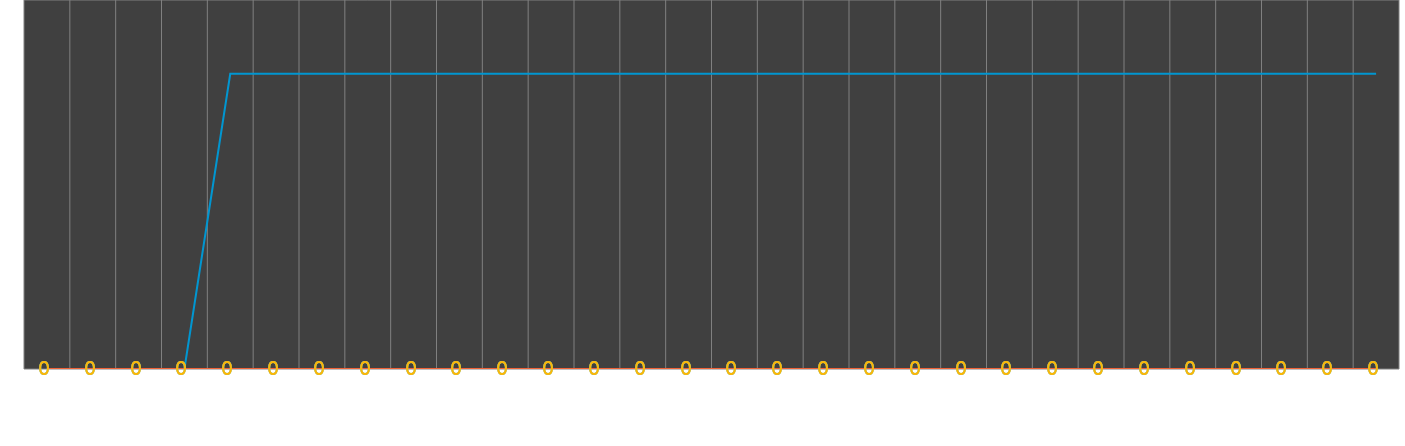
| Category | Opened | Closed | Opened Lables | Closed Labels |
|---|---|---|---|---|
| 5/1/18 | 0 | 0 | 0.08 | 0.08 |
| 5/2/18 | 0 | 0 | 0.08 | 0.08 |
| 5/3/18 | 0 | 0 | 0.08 | 0.08 |
| 5/4/18 | 0 | 0 | 0.08 | 0.08 |
| 5/5/18 | 2 | 0 | 2.08 | 0.08 |
| 5/6/18 | 2 | 0 | 2.08 | 0.08 |
| 5/7/18 | 2 | 0 | 2.08 | 0.08 |
| 5/8/18 | 2 | 0 | 2.08 | 0.08 |
| 5/9/18 | 2 | 0 | 2.08 | 0.08 |
| 5/10/18 | 2 | 0 | 2.08 | 0.08 |
| 5/11/18 | 2 | 0 | 2.08 | 0.08 |
| 5/12/18 | 2 | 0 | 2.08 | 0.08 |
| 5/13/18 | 2 | 0 | 2.08 | 0.08 |
| 5/14/18 | 2 | 0 | 2.08 | 0.08 |
| 5/15/18 | 2 | 0 | 2.08 | 0.08 |
| 5/16/18 | 2 | 0 | 2.08 | 0.08 |
| 5/17/18 | 2 | 0 | 2.08 | 0.08 |
| 5/18/18 | 2 | 0 | 2.08 | 0.08 |
| 5/19/18 | 2 | 0 | 2.08 | 0.08 |
| 5/20/18 | 2 | 0 | 2.08 | 0.08 |
| 5/21/18 | 2 | 0 | 2.08 | 0.08 |
| 5/22/18 | 2 | 0 | 2.08 | 0.08 |
| 5/23/18 | 2 | 0 | 2.08 | 0.08 |
| 5/24/18 | 2 | 0 | 2.08 | 0.08 |
| 5/25/18 | 2 | 0 | 2.08 | 0.08 |
| 5/26/18 | 2 | 0 | 2.08 | 0.08 |
| 5/27/18 | 2 | 0 | 2.08 | 0.08 |
| 5/28/18 | 2 | 0 | 2.08 | 0.08 |
| 5/29/18 | 2 | 0 | 2.08 | 0.08 |
| 5/30/18 | 2 | 0 | 2.08 | 0.08 |